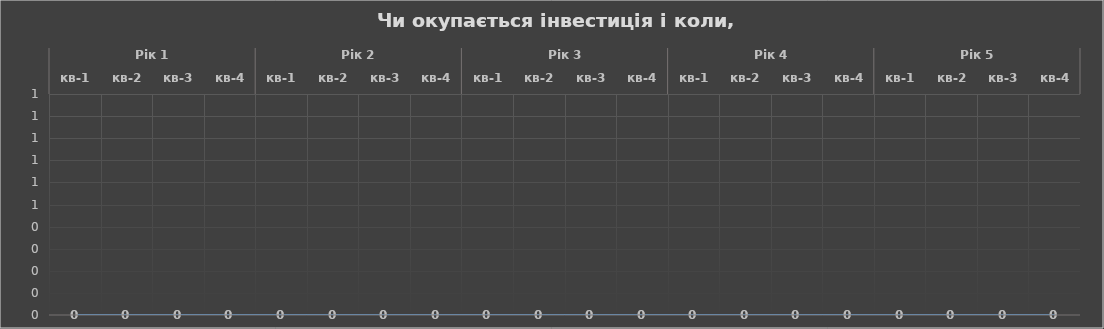
| Category | Чи окупається інвестиція і коли, грн |
|---|---|
| 0 | 0 |
| 1 | 0 |
| 2 | 0 |
| 3 | 0 |
| 4 | 0 |
| 5 | 0 |
| 6 | 0 |
| 7 | 0 |
| 8 | 0 |
| 9 | 0 |
| 10 | 0 |
| 11 | 0 |
| 12 | 0 |
| 13 | 0 |
| 14 | 0 |
| 15 | 0 |
| 16 | 0 |
| 17 | 0 |
| 18 | 0 |
| 19 | 0 |